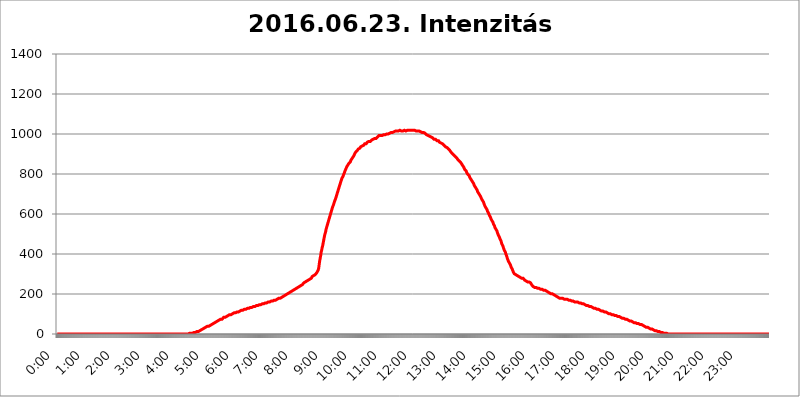
| Category | 2016.06.23. Intenzitás [W/m^2] |
|---|---|
| 0.0 | 0 |
| 0.0006944444444444445 | 0 |
| 0.001388888888888889 | 0 |
| 0.0020833333333333333 | 0 |
| 0.002777777777777778 | 0 |
| 0.003472222222222222 | 0 |
| 0.004166666666666667 | 0 |
| 0.004861111111111111 | 0 |
| 0.005555555555555556 | 0 |
| 0.0062499999999999995 | 0 |
| 0.006944444444444444 | 0 |
| 0.007638888888888889 | 0 |
| 0.008333333333333333 | 0 |
| 0.009027777777777779 | 0 |
| 0.009722222222222222 | 0 |
| 0.010416666666666666 | 0 |
| 0.011111111111111112 | 0 |
| 0.011805555555555555 | 0 |
| 0.012499999999999999 | 0 |
| 0.013194444444444444 | 0 |
| 0.013888888888888888 | 0 |
| 0.014583333333333332 | 0 |
| 0.015277777777777777 | 0 |
| 0.015972222222222224 | 0 |
| 0.016666666666666666 | 0 |
| 0.017361111111111112 | 0 |
| 0.018055555555555557 | 0 |
| 0.01875 | 0 |
| 0.019444444444444445 | 0 |
| 0.02013888888888889 | 0 |
| 0.020833333333333332 | 0 |
| 0.02152777777777778 | 0 |
| 0.022222222222222223 | 0 |
| 0.02291666666666667 | 0 |
| 0.02361111111111111 | 0 |
| 0.024305555555555556 | 0 |
| 0.024999999999999998 | 0 |
| 0.025694444444444447 | 0 |
| 0.02638888888888889 | 0 |
| 0.027083333333333334 | 0 |
| 0.027777777777777776 | 0 |
| 0.02847222222222222 | 0 |
| 0.029166666666666664 | 0 |
| 0.029861111111111113 | 0 |
| 0.030555555555555555 | 0 |
| 0.03125 | 0 |
| 0.03194444444444445 | 0 |
| 0.03263888888888889 | 0 |
| 0.03333333333333333 | 0 |
| 0.034027777777777775 | 0 |
| 0.034722222222222224 | 0 |
| 0.035416666666666666 | 0 |
| 0.036111111111111115 | 0 |
| 0.03680555555555556 | 0 |
| 0.0375 | 0 |
| 0.03819444444444444 | 0 |
| 0.03888888888888889 | 0 |
| 0.03958333333333333 | 0 |
| 0.04027777777777778 | 0 |
| 0.04097222222222222 | 0 |
| 0.041666666666666664 | 0 |
| 0.042361111111111106 | 0 |
| 0.04305555555555556 | 0 |
| 0.043750000000000004 | 0 |
| 0.044444444444444446 | 0 |
| 0.04513888888888889 | 0 |
| 0.04583333333333334 | 0 |
| 0.04652777777777778 | 0 |
| 0.04722222222222222 | 0 |
| 0.04791666666666666 | 0 |
| 0.04861111111111111 | 0 |
| 0.049305555555555554 | 0 |
| 0.049999999999999996 | 0 |
| 0.05069444444444445 | 0 |
| 0.051388888888888894 | 0 |
| 0.052083333333333336 | 0 |
| 0.05277777777777778 | 0 |
| 0.05347222222222222 | 0 |
| 0.05416666666666667 | 0 |
| 0.05486111111111111 | 0 |
| 0.05555555555555555 | 0 |
| 0.05625 | 0 |
| 0.05694444444444444 | 0 |
| 0.057638888888888885 | 0 |
| 0.05833333333333333 | 0 |
| 0.05902777777777778 | 0 |
| 0.059722222222222225 | 0 |
| 0.06041666666666667 | 0 |
| 0.061111111111111116 | 0 |
| 0.06180555555555556 | 0 |
| 0.0625 | 0 |
| 0.06319444444444444 | 0 |
| 0.06388888888888888 | 0 |
| 0.06458333333333334 | 0 |
| 0.06527777777777778 | 0 |
| 0.06597222222222222 | 0 |
| 0.06666666666666667 | 0 |
| 0.06736111111111111 | 0 |
| 0.06805555555555555 | 0 |
| 0.06874999999999999 | 0 |
| 0.06944444444444443 | 0 |
| 0.07013888888888889 | 0 |
| 0.07083333333333333 | 0 |
| 0.07152777777777779 | 0 |
| 0.07222222222222223 | 0 |
| 0.07291666666666667 | 0 |
| 0.07361111111111111 | 0 |
| 0.07430555555555556 | 0 |
| 0.075 | 0 |
| 0.07569444444444444 | 0 |
| 0.0763888888888889 | 0 |
| 0.07708333333333334 | 0 |
| 0.07777777777777778 | 0 |
| 0.07847222222222222 | 0 |
| 0.07916666666666666 | 0 |
| 0.0798611111111111 | 0 |
| 0.08055555555555556 | 0 |
| 0.08125 | 0 |
| 0.08194444444444444 | 0 |
| 0.08263888888888889 | 0 |
| 0.08333333333333333 | 0 |
| 0.08402777777777777 | 0 |
| 0.08472222222222221 | 0 |
| 0.08541666666666665 | 0 |
| 0.08611111111111112 | 0 |
| 0.08680555555555557 | 0 |
| 0.08750000000000001 | 0 |
| 0.08819444444444445 | 0 |
| 0.08888888888888889 | 0 |
| 0.08958333333333333 | 0 |
| 0.09027777777777778 | 0 |
| 0.09097222222222222 | 0 |
| 0.09166666666666667 | 0 |
| 0.09236111111111112 | 0 |
| 0.09305555555555556 | 0 |
| 0.09375 | 0 |
| 0.09444444444444444 | 0 |
| 0.09513888888888888 | 0 |
| 0.09583333333333333 | 0 |
| 0.09652777777777777 | 0 |
| 0.09722222222222222 | 0 |
| 0.09791666666666667 | 0 |
| 0.09861111111111111 | 0 |
| 0.09930555555555555 | 0 |
| 0.09999999999999999 | 0 |
| 0.10069444444444443 | 0 |
| 0.1013888888888889 | 0 |
| 0.10208333333333335 | 0 |
| 0.10277777777777779 | 0 |
| 0.10347222222222223 | 0 |
| 0.10416666666666667 | 0 |
| 0.10486111111111111 | 0 |
| 0.10555555555555556 | 0 |
| 0.10625 | 0 |
| 0.10694444444444444 | 0 |
| 0.1076388888888889 | 0 |
| 0.10833333333333334 | 0 |
| 0.10902777777777778 | 0 |
| 0.10972222222222222 | 0 |
| 0.1111111111111111 | 0 |
| 0.11180555555555556 | 0 |
| 0.11180555555555556 | 0 |
| 0.1125 | 0 |
| 0.11319444444444444 | 0 |
| 0.11388888888888889 | 0 |
| 0.11458333333333333 | 0 |
| 0.11527777777777777 | 0 |
| 0.11597222222222221 | 0 |
| 0.11666666666666665 | 0 |
| 0.1173611111111111 | 0 |
| 0.11805555555555557 | 0 |
| 0.11944444444444445 | 0 |
| 0.12013888888888889 | 0 |
| 0.12083333333333333 | 0 |
| 0.12152777777777778 | 0 |
| 0.12222222222222223 | 0 |
| 0.12291666666666667 | 0 |
| 0.12291666666666667 | 0 |
| 0.12361111111111112 | 0 |
| 0.12430555555555556 | 0 |
| 0.125 | 0 |
| 0.12569444444444444 | 0 |
| 0.12638888888888888 | 0 |
| 0.12708333333333333 | 0 |
| 0.16875 | 0 |
| 0.12847222222222224 | 0 |
| 0.12916666666666668 | 0 |
| 0.12986111111111112 | 0 |
| 0.13055555555555556 | 0 |
| 0.13125 | 0 |
| 0.13194444444444445 | 0 |
| 0.1326388888888889 | 0 |
| 0.13333333333333333 | 0 |
| 0.13402777777777777 | 0 |
| 0.13402777777777777 | 0 |
| 0.13472222222222222 | 0 |
| 0.13541666666666666 | 0 |
| 0.1361111111111111 | 0 |
| 0.13749999999999998 | 0 |
| 0.13819444444444443 | 0 |
| 0.1388888888888889 | 0 |
| 0.13958333333333334 | 0 |
| 0.14027777777777778 | 0 |
| 0.14097222222222222 | 0 |
| 0.14166666666666666 | 0 |
| 0.1423611111111111 | 0 |
| 0.14305555555555557 | 0 |
| 0.14375000000000002 | 0 |
| 0.14444444444444446 | 0 |
| 0.1451388888888889 | 0 |
| 0.1451388888888889 | 0 |
| 0.14652777777777778 | 0 |
| 0.14722222222222223 | 0 |
| 0.14791666666666667 | 0 |
| 0.1486111111111111 | 0 |
| 0.14930555555555555 | 0 |
| 0.15 | 0 |
| 0.15069444444444444 | 0 |
| 0.15138888888888888 | 0 |
| 0.15208333333333332 | 0 |
| 0.15277777777777776 | 0 |
| 0.15347222222222223 | 0 |
| 0.15416666666666667 | 0 |
| 0.15486111111111112 | 0 |
| 0.15555555555555556 | 0 |
| 0.15625 | 0 |
| 0.15694444444444444 | 0 |
| 0.15763888888888888 | 0 |
| 0.15833333333333333 | 0 |
| 0.15902777777777777 | 0 |
| 0.15972222222222224 | 0 |
| 0.16041666666666668 | 0 |
| 0.16111111111111112 | 0 |
| 0.16180555555555556 | 0 |
| 0.1625 | 0 |
| 0.16319444444444445 | 0 |
| 0.1638888888888889 | 0 |
| 0.16458333333333333 | 0 |
| 0.16527777777777777 | 0 |
| 0.16597222222222222 | 0 |
| 0.16666666666666666 | 0 |
| 0.1673611111111111 | 0 |
| 0.16805555555555554 | 0 |
| 0.16874999999999998 | 0 |
| 0.16944444444444443 | 0 |
| 0.17013888888888887 | 0 |
| 0.1708333333333333 | 0 |
| 0.17152777777777775 | 0 |
| 0.17222222222222225 | 0 |
| 0.1729166666666667 | 0 |
| 0.17361111111111113 | 0 |
| 0.17430555555555557 | 0 |
| 0.17500000000000002 | 0 |
| 0.17569444444444446 | 0 |
| 0.1763888888888889 | 0 |
| 0.17708333333333334 | 0 |
| 0.17777777777777778 | 0 |
| 0.17847222222222223 | 0 |
| 0.17916666666666667 | 0 |
| 0.1798611111111111 | 0 |
| 0.18055555555555555 | 0 |
| 0.18125 | 0 |
| 0.18194444444444444 | 0 |
| 0.1826388888888889 | 0 |
| 0.18333333333333335 | 0 |
| 0.1840277777777778 | 0 |
| 0.18472222222222223 | 0 |
| 0.18541666666666667 | 3.525 |
| 0.18611111111111112 | 3.525 |
| 0.18680555555555556 | 3.525 |
| 0.1875 | 3.525 |
| 0.18819444444444444 | 3.525 |
| 0.18888888888888888 | 3.525 |
| 0.18958333333333333 | 3.525 |
| 0.19027777777777777 | 3.525 |
| 0.1909722222222222 | 3.525 |
| 0.19166666666666665 | 7.887 |
| 0.19236111111111112 | 7.887 |
| 0.19305555555555554 | 7.887 |
| 0.19375 | 7.887 |
| 0.19444444444444445 | 7.887 |
| 0.1951388888888889 | 12.257 |
| 0.19583333333333333 | 12.257 |
| 0.19652777777777777 | 12.257 |
| 0.19722222222222222 | 12.257 |
| 0.19791666666666666 | 12.257 |
| 0.1986111111111111 | 16.636 |
| 0.19930555555555554 | 16.636 |
| 0.19999999999999998 | 16.636 |
| 0.20069444444444443 | 21.024 |
| 0.20138888888888887 | 21.024 |
| 0.2020833333333333 | 21.024 |
| 0.2027777777777778 | 21.024 |
| 0.2034722222222222 | 21.024 |
| 0.2041666666666667 | 25.419 |
| 0.20486111111111113 | 25.419 |
| 0.20555555555555557 | 25.419 |
| 0.20625000000000002 | 29.823 |
| 0.20694444444444446 | 29.823 |
| 0.2076388888888889 | 29.823 |
| 0.20833333333333334 | 34.234 |
| 0.20902777777777778 | 34.234 |
| 0.20972222222222223 | 34.234 |
| 0.21041666666666667 | 38.653 |
| 0.2111111111111111 | 38.653 |
| 0.21180555555555555 | 38.653 |
| 0.2125 | 38.653 |
| 0.21319444444444444 | 43.079 |
| 0.2138888888888889 | 43.079 |
| 0.21458333333333335 | 43.079 |
| 0.2152777777777778 | 47.511 |
| 0.21597222222222223 | 47.511 |
| 0.21666666666666667 | 47.511 |
| 0.21736111111111112 | 47.511 |
| 0.21805555555555556 | 51.951 |
| 0.21875 | 51.951 |
| 0.21944444444444444 | 51.951 |
| 0.22013888888888888 | 56.398 |
| 0.22083333333333333 | 56.398 |
| 0.22152777777777777 | 56.398 |
| 0.2222222222222222 | 60.85 |
| 0.22291666666666665 | 60.85 |
| 0.2236111111111111 | 60.85 |
| 0.22430555555555556 | 65.31 |
| 0.225 | 65.31 |
| 0.22569444444444445 | 65.31 |
| 0.2263888888888889 | 65.31 |
| 0.22708333333333333 | 69.775 |
| 0.22777777777777777 | 69.775 |
| 0.22847222222222222 | 69.775 |
| 0.22916666666666666 | 74.246 |
| 0.2298611111111111 | 74.246 |
| 0.23055555555555554 | 74.246 |
| 0.23124999999999998 | 74.246 |
| 0.23194444444444443 | 78.722 |
| 0.23263888888888887 | 78.722 |
| 0.2333333333333333 | 83.205 |
| 0.2340277777777778 | 83.205 |
| 0.2347222222222222 | 83.205 |
| 0.2354166666666667 | 83.205 |
| 0.23611111111111113 | 83.205 |
| 0.23680555555555557 | 87.692 |
| 0.23750000000000002 | 87.692 |
| 0.23819444444444446 | 92.184 |
| 0.2388888888888889 | 92.184 |
| 0.23958333333333334 | 92.184 |
| 0.24027777777777778 | 92.184 |
| 0.24097222222222223 | 92.184 |
| 0.24166666666666667 | 96.682 |
| 0.2423611111111111 | 96.682 |
| 0.24305555555555555 | 96.682 |
| 0.24375 | 96.682 |
| 0.24444444444444446 | 101.184 |
| 0.24513888888888888 | 101.184 |
| 0.24583333333333335 | 101.184 |
| 0.2465277777777778 | 101.184 |
| 0.24722222222222223 | 101.184 |
| 0.24791666666666667 | 105.69 |
| 0.24861111111111112 | 105.69 |
| 0.24930555555555556 | 105.69 |
| 0.25 | 105.69 |
| 0.25069444444444444 | 110.201 |
| 0.2513888888888889 | 110.201 |
| 0.2520833333333333 | 110.201 |
| 0.25277777777777777 | 110.201 |
| 0.2534722222222222 | 110.201 |
| 0.25416666666666665 | 110.201 |
| 0.2548611111111111 | 114.716 |
| 0.2555555555555556 | 114.716 |
| 0.25625000000000003 | 114.716 |
| 0.2569444444444445 | 114.716 |
| 0.2576388888888889 | 119.235 |
| 0.25833333333333336 | 119.235 |
| 0.2590277777777778 | 119.235 |
| 0.25972222222222224 | 119.235 |
| 0.2604166666666667 | 119.235 |
| 0.2611111111111111 | 119.235 |
| 0.26180555555555557 | 119.235 |
| 0.2625 | 123.758 |
| 0.26319444444444445 | 123.758 |
| 0.2638888888888889 | 123.758 |
| 0.26458333333333334 | 123.758 |
| 0.2652777777777778 | 123.758 |
| 0.2659722222222222 | 128.284 |
| 0.26666666666666666 | 128.284 |
| 0.2673611111111111 | 128.284 |
| 0.26805555555555555 | 128.284 |
| 0.26875 | 128.284 |
| 0.26944444444444443 | 128.284 |
| 0.2701388888888889 | 132.814 |
| 0.2708333333333333 | 132.814 |
| 0.27152777777777776 | 132.814 |
| 0.2722222222222222 | 132.814 |
| 0.27291666666666664 | 132.814 |
| 0.2736111111111111 | 132.814 |
| 0.2743055555555555 | 137.347 |
| 0.27499999999999997 | 137.347 |
| 0.27569444444444446 | 137.347 |
| 0.27638888888888885 | 137.347 |
| 0.27708333333333335 | 137.347 |
| 0.2777777777777778 | 137.347 |
| 0.27847222222222223 | 137.347 |
| 0.2791666666666667 | 141.884 |
| 0.2798611111111111 | 141.884 |
| 0.28055555555555556 | 141.884 |
| 0.28125 | 141.884 |
| 0.28194444444444444 | 141.884 |
| 0.2826388888888889 | 146.423 |
| 0.2833333333333333 | 146.423 |
| 0.28402777777777777 | 146.423 |
| 0.2847222222222222 | 146.423 |
| 0.28541666666666665 | 146.423 |
| 0.28611111111111115 | 146.423 |
| 0.28680555555555554 | 146.423 |
| 0.28750000000000003 | 150.964 |
| 0.2881944444444445 | 150.964 |
| 0.2888888888888889 | 150.964 |
| 0.28958333333333336 | 150.964 |
| 0.2902777777777778 | 155.509 |
| 0.29097222222222224 | 155.509 |
| 0.2916666666666667 | 155.509 |
| 0.2923611111111111 | 155.509 |
| 0.29305555555555557 | 155.509 |
| 0.29375 | 155.509 |
| 0.29444444444444445 | 155.509 |
| 0.2951388888888889 | 160.056 |
| 0.29583333333333334 | 160.056 |
| 0.2965277777777778 | 160.056 |
| 0.2972222222222222 | 160.056 |
| 0.29791666666666666 | 160.056 |
| 0.2986111111111111 | 164.605 |
| 0.29930555555555555 | 164.605 |
| 0.3 | 164.605 |
| 0.30069444444444443 | 164.605 |
| 0.3013888888888889 | 164.605 |
| 0.3020833333333333 | 164.605 |
| 0.30277777777777776 | 164.605 |
| 0.3034722222222222 | 169.156 |
| 0.30416666666666664 | 169.156 |
| 0.3048611111111111 | 169.156 |
| 0.3055555555555555 | 169.156 |
| 0.30624999999999997 | 169.156 |
| 0.3069444444444444 | 173.709 |
| 0.3076388888888889 | 173.709 |
| 0.30833333333333335 | 173.709 |
| 0.3090277777777778 | 173.709 |
| 0.30972222222222223 | 173.709 |
| 0.3104166666666667 | 178.264 |
| 0.3111111111111111 | 178.264 |
| 0.31180555555555556 | 178.264 |
| 0.3125 | 178.264 |
| 0.31319444444444444 | 182.82 |
| 0.3138888888888889 | 182.82 |
| 0.3145833333333333 | 182.82 |
| 0.31527777777777777 | 182.82 |
| 0.3159722222222222 | 187.378 |
| 0.31666666666666665 | 187.378 |
| 0.31736111111111115 | 191.937 |
| 0.31805555555555554 | 191.937 |
| 0.31875000000000003 | 191.937 |
| 0.3194444444444445 | 196.497 |
| 0.3201388888888889 | 196.497 |
| 0.32083333333333336 | 196.497 |
| 0.3215277777777778 | 201.058 |
| 0.32222222222222224 | 201.058 |
| 0.3229166666666667 | 201.058 |
| 0.3236111111111111 | 205.62 |
| 0.32430555555555557 | 205.62 |
| 0.325 | 205.62 |
| 0.32569444444444445 | 210.182 |
| 0.3263888888888889 | 210.182 |
| 0.32708333333333334 | 210.182 |
| 0.3277777777777778 | 210.182 |
| 0.3284722222222222 | 214.746 |
| 0.32916666666666666 | 214.746 |
| 0.3298611111111111 | 219.309 |
| 0.33055555555555555 | 219.309 |
| 0.33125 | 219.309 |
| 0.33194444444444443 | 219.309 |
| 0.3326388888888889 | 223.873 |
| 0.3333333333333333 | 223.873 |
| 0.3340277777777778 | 228.436 |
| 0.3347222222222222 | 228.436 |
| 0.3354166666666667 | 228.436 |
| 0.3361111111111111 | 228.436 |
| 0.3368055555555556 | 233 |
| 0.33749999999999997 | 233 |
| 0.33819444444444446 | 233 |
| 0.33888888888888885 | 237.564 |
| 0.33958333333333335 | 237.564 |
| 0.34027777777777773 | 237.564 |
| 0.34097222222222223 | 242.127 |
| 0.3416666666666666 | 242.127 |
| 0.3423611111111111 | 246.689 |
| 0.3430555555555555 | 246.689 |
| 0.34375 | 246.689 |
| 0.3444444444444445 | 251.251 |
| 0.3451388888888889 | 251.251 |
| 0.3458333333333334 | 255.813 |
| 0.34652777777777777 | 255.813 |
| 0.34722222222222227 | 255.813 |
| 0.34791666666666665 | 260.373 |
| 0.34861111111111115 | 260.373 |
| 0.34930555555555554 | 260.373 |
| 0.35000000000000003 | 264.932 |
| 0.3506944444444444 | 264.932 |
| 0.3513888888888889 | 264.932 |
| 0.3520833333333333 | 269.49 |
| 0.3527777777777778 | 269.49 |
| 0.3534722222222222 | 274.047 |
| 0.3541666666666667 | 274.047 |
| 0.3548611111111111 | 278.603 |
| 0.35555555555555557 | 278.603 |
| 0.35625 | 278.603 |
| 0.35694444444444445 | 283.156 |
| 0.3576388888888889 | 287.709 |
| 0.35833333333333334 | 287.709 |
| 0.3590277777777778 | 287.709 |
| 0.3597222222222222 | 292.259 |
| 0.36041666666666666 | 292.259 |
| 0.3611111111111111 | 296.808 |
| 0.36180555555555555 | 296.808 |
| 0.3625 | 301.354 |
| 0.36319444444444443 | 301.354 |
| 0.3638888888888889 | 305.898 |
| 0.3645833333333333 | 305.898 |
| 0.3652777777777778 | 310.44 |
| 0.3659722222222222 | 319.517 |
| 0.3666666666666667 | 328.584 |
| 0.3673611111111111 | 346.682 |
| 0.3680555555555556 | 364.728 |
| 0.36874999999999997 | 378.224 |
| 0.36944444444444446 | 391.685 |
| 0.37013888888888885 | 409.574 |
| 0.37083333333333335 | 418.492 |
| 0.37152777777777773 | 431.833 |
| 0.37222222222222223 | 440.702 |
| 0.3729166666666666 | 453.968 |
| 0.3736111111111111 | 467.187 |
| 0.3743055555555555 | 480.356 |
| 0.375 | 493.475 |
| 0.3756944444444445 | 502.192 |
| 0.3763888888888889 | 510.885 |
| 0.3770833333333334 | 523.88 |
| 0.37777777777777777 | 532.513 |
| 0.37847222222222227 | 541.121 |
| 0.37916666666666665 | 549.704 |
| 0.37986111111111115 | 558.261 |
| 0.38055555555555554 | 566.793 |
| 0.38125000000000003 | 575.299 |
| 0.3819444444444444 | 583.779 |
| 0.3826388888888889 | 592.233 |
| 0.3833333333333333 | 600.661 |
| 0.3840277777777778 | 609.062 |
| 0.3847222222222222 | 617.436 |
| 0.3854166666666667 | 625.784 |
| 0.3861111111111111 | 634.105 |
| 0.38680555555555557 | 638.256 |
| 0.3875 | 646.537 |
| 0.38819444444444445 | 654.791 |
| 0.3888888888888889 | 663.019 |
| 0.38958333333333334 | 667.123 |
| 0.3902777777777778 | 675.311 |
| 0.3909722222222222 | 683.473 |
| 0.39166666666666666 | 691.608 |
| 0.3923611111111111 | 699.717 |
| 0.39305555555555555 | 703.762 |
| 0.39375 | 715.858 |
| 0.39444444444444443 | 723.889 |
| 0.3951388888888889 | 731.896 |
| 0.3958333333333333 | 739.877 |
| 0.3965277777777778 | 747.834 |
| 0.3972222222222222 | 755.766 |
| 0.3979166666666667 | 763.674 |
| 0.3986111111111111 | 771.559 |
| 0.3993055555555556 | 779.42 |
| 0.39999999999999997 | 783.342 |
| 0.40069444444444446 | 787.258 |
| 0.40138888888888885 | 795.074 |
| 0.40208333333333335 | 798.974 |
| 0.40277777777777773 | 806.757 |
| 0.40347222222222223 | 814.519 |
| 0.4041666666666666 | 818.392 |
| 0.4048611111111111 | 826.123 |
| 0.4055555555555555 | 829.981 |
| 0.40625 | 837.682 |
| 0.4069444444444445 | 841.526 |
| 0.4076388888888889 | 845.365 |
| 0.4083333333333334 | 849.199 |
| 0.40902777777777777 | 853.029 |
| 0.40972222222222227 | 853.029 |
| 0.41041666666666665 | 856.855 |
| 0.41111111111111115 | 860.676 |
| 0.41180555555555554 | 868.305 |
| 0.41250000000000003 | 872.114 |
| 0.4131944444444444 | 875.918 |
| 0.4138888888888889 | 875.918 |
| 0.4145833333333333 | 883.516 |
| 0.4152777777777778 | 887.309 |
| 0.4159722222222222 | 891.099 |
| 0.4166666666666667 | 894.885 |
| 0.4173611111111111 | 902.447 |
| 0.41805555555555557 | 906.223 |
| 0.41875 | 909.996 |
| 0.41944444444444445 | 909.996 |
| 0.4201388888888889 | 913.766 |
| 0.42083333333333334 | 917.534 |
| 0.4215277777777778 | 921.298 |
| 0.4222222222222222 | 925.06 |
| 0.42291666666666666 | 925.06 |
| 0.4236111111111111 | 928.819 |
| 0.42430555555555555 | 928.819 |
| 0.425 | 932.576 |
| 0.42569444444444443 | 936.33 |
| 0.4263888888888889 | 936.33 |
| 0.4270833333333333 | 940.082 |
| 0.4277777777777778 | 940.082 |
| 0.4284722222222222 | 940.082 |
| 0.4291666666666667 | 943.832 |
| 0.4298611111111111 | 943.832 |
| 0.4305555555555556 | 947.58 |
| 0.43124999999999997 | 951.327 |
| 0.43194444444444446 | 951.327 |
| 0.43263888888888885 | 951.327 |
| 0.43333333333333335 | 951.327 |
| 0.43402777777777773 | 955.071 |
| 0.43472222222222223 | 958.814 |
| 0.4354166666666666 | 958.814 |
| 0.4361111111111111 | 958.814 |
| 0.4368055555555555 | 962.555 |
| 0.4375 | 962.555 |
| 0.4381944444444445 | 962.555 |
| 0.4388888888888889 | 962.555 |
| 0.4395833333333334 | 966.295 |
| 0.44027777777777777 | 966.295 |
| 0.44097222222222227 | 970.034 |
| 0.44166666666666665 | 970.034 |
| 0.44236111111111115 | 970.034 |
| 0.44305555555555554 | 973.772 |
| 0.44375000000000003 | 973.772 |
| 0.4444444444444444 | 973.772 |
| 0.4451388888888889 | 977.508 |
| 0.4458333333333333 | 977.508 |
| 0.4465277777777778 | 977.508 |
| 0.4472222222222222 | 977.508 |
| 0.4479166666666667 | 981.244 |
| 0.4486111111111111 | 981.244 |
| 0.44930555555555557 | 984.98 |
| 0.45 | 984.98 |
| 0.45069444444444445 | 988.714 |
| 0.4513888888888889 | 992.448 |
| 0.45208333333333334 | 992.448 |
| 0.4527777777777778 | 992.448 |
| 0.4534722222222222 | 992.448 |
| 0.45416666666666666 | 992.448 |
| 0.4548611111111111 | 992.448 |
| 0.45555555555555555 | 992.448 |
| 0.45625 | 996.182 |
| 0.45694444444444443 | 996.182 |
| 0.4576388888888889 | 996.182 |
| 0.4583333333333333 | 996.182 |
| 0.4590277777777778 | 996.182 |
| 0.4597222222222222 | 996.182 |
| 0.4604166666666667 | 996.182 |
| 0.4611111111111111 | 996.182 |
| 0.4618055555555556 | 999.916 |
| 0.46249999999999997 | 999.916 |
| 0.46319444444444446 | 999.916 |
| 0.46388888888888885 | 999.916 |
| 0.46458333333333335 | 1003.65 |
| 0.46527777777777773 | 1003.65 |
| 0.46597222222222223 | 1003.65 |
| 0.4666666666666666 | 1003.65 |
| 0.4673611111111111 | 1003.65 |
| 0.4680555555555555 | 1007.383 |
| 0.46875 | 1007.383 |
| 0.4694444444444445 | 1007.383 |
| 0.4701388888888889 | 1007.383 |
| 0.4708333333333334 | 1007.383 |
| 0.47152777777777777 | 1011.118 |
| 0.47222222222222227 | 1011.118 |
| 0.47291666666666665 | 1011.118 |
| 0.47361111111111115 | 1011.118 |
| 0.47430555555555554 | 1014.852 |
| 0.47500000000000003 | 1014.852 |
| 0.4756944444444444 | 1014.852 |
| 0.4763888888888889 | 1014.852 |
| 0.4770833333333333 | 1014.852 |
| 0.4777777777777778 | 1014.852 |
| 0.4784722222222222 | 1014.852 |
| 0.4791666666666667 | 1014.852 |
| 0.4798611111111111 | 1014.852 |
| 0.48055555555555557 | 1018.587 |
| 0.48125 | 1018.587 |
| 0.48194444444444445 | 1018.587 |
| 0.4826388888888889 | 1014.852 |
| 0.48333333333333334 | 1014.852 |
| 0.4840277777777778 | 1014.852 |
| 0.4847222222222222 | 1014.852 |
| 0.48541666666666666 | 1014.852 |
| 0.4861111111111111 | 1018.587 |
| 0.48680555555555555 | 1018.587 |
| 0.4875 | 1014.852 |
| 0.48819444444444443 | 1018.587 |
| 0.4888888888888889 | 1014.852 |
| 0.4895833333333333 | 1018.587 |
| 0.4902777777777778 | 1018.587 |
| 0.4909722222222222 | 1018.587 |
| 0.4916666666666667 | 1018.587 |
| 0.4923611111111111 | 1018.587 |
| 0.4930555555555556 | 1018.587 |
| 0.49374999999999997 | 1018.587 |
| 0.49444444444444446 | 1018.587 |
| 0.49513888888888885 | 1018.587 |
| 0.49583333333333335 | 1018.587 |
| 0.49652777777777773 | 1018.587 |
| 0.49722222222222223 | 1018.587 |
| 0.4979166666666666 | 1014.852 |
| 0.4986111111111111 | 1018.587 |
| 0.4993055555555555 | 1018.587 |
| 0.5 | 1018.587 |
| 0.5006944444444444 | 1018.587 |
| 0.5013888888888889 | 1018.587 |
| 0.5020833333333333 | 1018.587 |
| 0.5027777777777778 | 1014.852 |
| 0.5034722222222222 | 1014.852 |
| 0.5041666666666667 | 1014.852 |
| 0.5048611111111111 | 1018.587 |
| 0.5055555555555555 | 1014.852 |
| 0.50625 | 1014.852 |
| 0.5069444444444444 | 1014.852 |
| 0.5076388888888889 | 1014.852 |
| 0.5083333333333333 | 1014.852 |
| 0.5090277777777777 | 1014.852 |
| 0.5097222222222222 | 1011.118 |
| 0.5104166666666666 | 1011.118 |
| 0.5111111111111112 | 1007.383 |
| 0.5118055555555555 | 1007.383 |
| 0.5125000000000001 | 1007.383 |
| 0.5131944444444444 | 1007.383 |
| 0.513888888888889 | 1007.383 |
| 0.5145833333333333 | 1003.65 |
| 0.5152777777777778 | 1003.65 |
| 0.5159722222222222 | 1003.65 |
| 0.5166666666666667 | 999.916 |
| 0.517361111111111 | 999.916 |
| 0.5180555555555556 | 996.182 |
| 0.5187499999999999 | 996.182 |
| 0.5194444444444445 | 996.182 |
| 0.5201388888888888 | 992.448 |
| 0.5208333333333334 | 992.448 |
| 0.5215277777777778 | 992.448 |
| 0.5222222222222223 | 988.714 |
| 0.5229166666666667 | 988.714 |
| 0.5236111111111111 | 984.98 |
| 0.5243055555555556 | 984.98 |
| 0.525 | 981.244 |
| 0.5256944444444445 | 981.244 |
| 0.5263888888888889 | 981.244 |
| 0.5270833333333333 | 977.508 |
| 0.5277777777777778 | 977.508 |
| 0.5284722222222222 | 973.772 |
| 0.5291666666666667 | 973.772 |
| 0.5298611111111111 | 973.772 |
| 0.5305555555555556 | 973.772 |
| 0.53125 | 973.772 |
| 0.5319444444444444 | 970.034 |
| 0.5326388888888889 | 966.295 |
| 0.5333333333333333 | 966.295 |
| 0.5340277777777778 | 966.295 |
| 0.5347222222222222 | 966.295 |
| 0.5354166666666667 | 962.555 |
| 0.5361111111111111 | 958.814 |
| 0.5368055555555555 | 958.814 |
| 0.5375 | 958.814 |
| 0.5381944444444444 | 955.071 |
| 0.5388888888888889 | 955.071 |
| 0.5395833333333333 | 955.071 |
| 0.5402777777777777 | 951.327 |
| 0.5409722222222222 | 947.58 |
| 0.5416666666666666 | 947.58 |
| 0.5423611111111112 | 943.832 |
| 0.5430555555555555 | 940.082 |
| 0.5437500000000001 | 940.082 |
| 0.5444444444444444 | 936.33 |
| 0.545138888888889 | 932.576 |
| 0.5458333333333333 | 932.576 |
| 0.5465277777777778 | 932.576 |
| 0.5472222222222222 | 932.576 |
| 0.5479166666666667 | 928.819 |
| 0.548611111111111 | 925.06 |
| 0.5493055555555556 | 921.298 |
| 0.5499999999999999 | 921.298 |
| 0.5506944444444445 | 917.534 |
| 0.5513888888888888 | 913.766 |
| 0.5520833333333334 | 909.996 |
| 0.5527777777777778 | 906.223 |
| 0.5534722222222223 | 906.223 |
| 0.5541666666666667 | 902.447 |
| 0.5548611111111111 | 902.447 |
| 0.5555555555555556 | 898.668 |
| 0.55625 | 894.885 |
| 0.5569444444444445 | 894.885 |
| 0.5576388888888889 | 891.099 |
| 0.5583333333333333 | 887.309 |
| 0.5590277777777778 | 887.309 |
| 0.5597222222222222 | 883.516 |
| 0.5604166666666667 | 879.719 |
| 0.5611111111111111 | 875.918 |
| 0.5618055555555556 | 872.114 |
| 0.5625 | 868.305 |
| 0.5631944444444444 | 868.305 |
| 0.5638888888888889 | 864.493 |
| 0.5645833333333333 | 860.676 |
| 0.5652777777777778 | 860.676 |
| 0.5659722222222222 | 856.855 |
| 0.5666666666666667 | 853.029 |
| 0.5673611111111111 | 849.199 |
| 0.5680555555555555 | 845.365 |
| 0.56875 | 841.526 |
| 0.5694444444444444 | 837.682 |
| 0.5701388888888889 | 833.834 |
| 0.5708333333333333 | 829.981 |
| 0.5715277777777777 | 822.26 |
| 0.5722222222222222 | 822.26 |
| 0.5729166666666666 | 818.392 |
| 0.5736111111111112 | 814.519 |
| 0.5743055555555555 | 806.757 |
| 0.5750000000000001 | 806.757 |
| 0.5756944444444444 | 798.974 |
| 0.576388888888889 | 798.974 |
| 0.5770833333333333 | 795.074 |
| 0.5777777777777778 | 791.169 |
| 0.5784722222222222 | 783.342 |
| 0.5791666666666667 | 783.342 |
| 0.579861111111111 | 775.492 |
| 0.5805555555555556 | 771.559 |
| 0.5812499999999999 | 767.62 |
| 0.5819444444444445 | 763.674 |
| 0.5826388888888888 | 759.723 |
| 0.5833333333333334 | 755.766 |
| 0.5840277777777778 | 751.803 |
| 0.5847222222222223 | 743.859 |
| 0.5854166666666667 | 739.877 |
| 0.5861111111111111 | 735.89 |
| 0.5868055555555556 | 731.896 |
| 0.5875 | 727.896 |
| 0.5881944444444445 | 723.889 |
| 0.5888888888888889 | 719.877 |
| 0.5895833333333333 | 711.832 |
| 0.5902777777777778 | 707.8 |
| 0.5909722222222222 | 703.762 |
| 0.5916666666666667 | 699.717 |
| 0.5923611111111111 | 695.666 |
| 0.5930555555555556 | 691.608 |
| 0.59375 | 687.544 |
| 0.5944444444444444 | 683.473 |
| 0.5951388888888889 | 675.311 |
| 0.5958333333333333 | 675.311 |
| 0.5965277777777778 | 667.123 |
| 0.5972222222222222 | 663.019 |
| 0.5979166666666667 | 658.909 |
| 0.5986111111111111 | 650.667 |
| 0.5993055555555555 | 646.537 |
| 0.6 | 638.256 |
| 0.6006944444444444 | 634.105 |
| 0.6013888888888889 | 629.948 |
| 0.6020833333333333 | 625.784 |
| 0.6027777777777777 | 621.613 |
| 0.6034722222222222 | 613.252 |
| 0.6041666666666666 | 609.062 |
| 0.6048611111111112 | 604.864 |
| 0.6055555555555555 | 600.661 |
| 0.6062500000000001 | 592.233 |
| 0.6069444444444444 | 588.009 |
| 0.607638888888889 | 583.779 |
| 0.6083333333333333 | 575.299 |
| 0.6090277777777778 | 571.049 |
| 0.6097222222222222 | 566.793 |
| 0.6104166666666667 | 562.53 |
| 0.611111111111111 | 558.261 |
| 0.6118055555555556 | 549.704 |
| 0.6124999999999999 | 545.416 |
| 0.6131944444444445 | 541.121 |
| 0.6138888888888888 | 532.513 |
| 0.6145833333333334 | 528.2 |
| 0.6152777777777778 | 523.88 |
| 0.6159722222222223 | 519.555 |
| 0.6166666666666667 | 515.223 |
| 0.6173611111111111 | 506.542 |
| 0.6180555555555556 | 502.192 |
| 0.61875 | 493.475 |
| 0.6194444444444445 | 489.108 |
| 0.6201388888888889 | 484.735 |
| 0.6208333333333333 | 475.972 |
| 0.6215277777777778 | 471.582 |
| 0.6222222222222222 | 467.187 |
| 0.6229166666666667 | 458.38 |
| 0.6236111111111111 | 449.551 |
| 0.6243055555555556 | 445.129 |
| 0.625 | 440.702 |
| 0.6256944444444444 | 431.833 |
| 0.6263888888888889 | 427.39 |
| 0.6270833333333333 | 418.492 |
| 0.6277777777777778 | 414.035 |
| 0.6284722222222222 | 409.574 |
| 0.6291666666666667 | 400.638 |
| 0.6298611111111111 | 396.164 |
| 0.6305555555555555 | 387.202 |
| 0.63125 | 378.224 |
| 0.6319444444444444 | 373.729 |
| 0.6326388888888889 | 364.728 |
| 0.6333333333333333 | 360.221 |
| 0.6340277777777777 | 355.712 |
| 0.6347222222222222 | 351.198 |
| 0.6354166666666666 | 346.682 |
| 0.6361111111111112 | 342.162 |
| 0.6368055555555555 | 333.113 |
| 0.6375000000000001 | 333.113 |
| 0.6381944444444444 | 324.052 |
| 0.638888888888889 | 319.517 |
| 0.6395833333333333 | 310.44 |
| 0.6402777777777778 | 305.898 |
| 0.6409722222222222 | 301.354 |
| 0.6416666666666667 | 301.354 |
| 0.642361111111111 | 296.808 |
| 0.6430555555555556 | 296.808 |
| 0.6437499999999999 | 296.808 |
| 0.6444444444444445 | 292.259 |
| 0.6451388888888888 | 292.259 |
| 0.6458333333333334 | 287.709 |
| 0.6465277777777778 | 287.709 |
| 0.6472222222222223 | 287.709 |
| 0.6479166666666667 | 287.709 |
| 0.6486111111111111 | 287.709 |
| 0.6493055555555556 | 283.156 |
| 0.65 | 283.156 |
| 0.6506944444444445 | 283.156 |
| 0.6513888888888889 | 278.603 |
| 0.6520833333333333 | 278.603 |
| 0.6527777777777778 | 278.603 |
| 0.6534722222222222 | 278.603 |
| 0.6541666666666667 | 274.047 |
| 0.6548611111111111 | 274.047 |
| 0.6555555555555556 | 269.49 |
| 0.65625 | 269.49 |
| 0.6569444444444444 | 269.49 |
| 0.6576388888888889 | 264.932 |
| 0.6583333333333333 | 264.932 |
| 0.6590277777777778 | 260.373 |
| 0.6597222222222222 | 260.373 |
| 0.6604166666666667 | 260.373 |
| 0.6611111111111111 | 260.373 |
| 0.6618055555555555 | 260.373 |
| 0.6625 | 260.373 |
| 0.6631944444444444 | 260.373 |
| 0.6638888888888889 | 255.813 |
| 0.6645833333333333 | 255.813 |
| 0.6652777777777777 | 246.689 |
| 0.6659722222222222 | 242.127 |
| 0.6666666666666666 | 242.127 |
| 0.6673611111111111 | 237.564 |
| 0.6680555555555556 | 233 |
| 0.6687500000000001 | 233 |
| 0.6694444444444444 | 233 |
| 0.6701388888888888 | 233 |
| 0.6708333333333334 | 233 |
| 0.6715277777777778 | 233 |
| 0.6722222222222222 | 233 |
| 0.6729166666666666 | 228.436 |
| 0.6736111111111112 | 228.436 |
| 0.6743055555555556 | 228.436 |
| 0.6749999999999999 | 228.436 |
| 0.6756944444444444 | 228.436 |
| 0.6763888888888889 | 228.436 |
| 0.6770833333333334 | 228.436 |
| 0.6777777777777777 | 223.873 |
| 0.6784722222222223 | 223.873 |
| 0.6791666666666667 | 223.873 |
| 0.6798611111111111 | 223.873 |
| 0.6805555555555555 | 223.873 |
| 0.68125 | 219.309 |
| 0.6819444444444445 | 219.309 |
| 0.6826388888888889 | 219.309 |
| 0.6833333333333332 | 219.309 |
| 0.6840277777777778 | 219.309 |
| 0.6847222222222222 | 219.309 |
| 0.6854166666666667 | 214.746 |
| 0.686111111111111 | 214.746 |
| 0.6868055555555556 | 214.746 |
| 0.6875 | 210.182 |
| 0.6881944444444444 | 210.182 |
| 0.688888888888889 | 210.182 |
| 0.6895833333333333 | 210.182 |
| 0.6902777777777778 | 205.62 |
| 0.6909722222222222 | 205.62 |
| 0.6916666666666668 | 205.62 |
| 0.6923611111111111 | 201.058 |
| 0.6930555555555555 | 201.058 |
| 0.69375 | 201.058 |
| 0.6944444444444445 | 201.058 |
| 0.6951388888888889 | 196.497 |
| 0.6958333333333333 | 196.497 |
| 0.6965277777777777 | 196.497 |
| 0.6972222222222223 | 196.497 |
| 0.6979166666666666 | 191.937 |
| 0.6986111111111111 | 191.937 |
| 0.6993055555555556 | 191.937 |
| 0.7000000000000001 | 187.378 |
| 0.7006944444444444 | 187.378 |
| 0.7013888888888888 | 182.82 |
| 0.7020833333333334 | 182.82 |
| 0.7027777777777778 | 182.82 |
| 0.7034722222222222 | 182.82 |
| 0.7041666666666666 | 182.82 |
| 0.7048611111111112 | 178.264 |
| 0.7055555555555556 | 182.82 |
| 0.7062499999999999 | 178.264 |
| 0.7069444444444444 | 178.264 |
| 0.7076388888888889 | 178.264 |
| 0.7083333333333334 | 178.264 |
| 0.7090277777777777 | 178.264 |
| 0.7097222222222223 | 173.709 |
| 0.7104166666666667 | 173.709 |
| 0.7111111111111111 | 173.709 |
| 0.7118055555555555 | 173.709 |
| 0.7125 | 173.709 |
| 0.7131944444444445 | 173.709 |
| 0.7138888888888889 | 173.709 |
| 0.7145833333333332 | 173.709 |
| 0.7152777777777778 | 173.709 |
| 0.7159722222222222 | 173.709 |
| 0.7166666666666667 | 169.156 |
| 0.717361111111111 | 169.156 |
| 0.7180555555555556 | 169.156 |
| 0.71875 | 169.156 |
| 0.7194444444444444 | 169.156 |
| 0.720138888888889 | 164.605 |
| 0.7208333333333333 | 164.605 |
| 0.7215277777777778 | 164.605 |
| 0.7222222222222222 | 164.605 |
| 0.7229166666666668 | 164.605 |
| 0.7236111111111111 | 164.605 |
| 0.7243055555555555 | 164.605 |
| 0.725 | 160.056 |
| 0.7256944444444445 | 160.056 |
| 0.7263888888888889 | 160.056 |
| 0.7270833333333333 | 160.056 |
| 0.7277777777777777 | 160.056 |
| 0.7284722222222223 | 160.056 |
| 0.7291666666666666 | 160.056 |
| 0.7298611111111111 | 160.056 |
| 0.7305555555555556 | 160.056 |
| 0.7312500000000001 | 155.509 |
| 0.7319444444444444 | 155.509 |
| 0.7326388888888888 | 155.509 |
| 0.7333333333333334 | 155.509 |
| 0.7340277777777778 | 155.509 |
| 0.7347222222222222 | 155.509 |
| 0.7354166666666666 | 150.964 |
| 0.7361111111111112 | 150.964 |
| 0.7368055555555556 | 150.964 |
| 0.7374999999999999 | 150.964 |
| 0.7381944444444444 | 150.964 |
| 0.7388888888888889 | 150.964 |
| 0.7395833333333334 | 146.423 |
| 0.7402777777777777 | 146.423 |
| 0.7409722222222223 | 146.423 |
| 0.7416666666666667 | 146.423 |
| 0.7423611111111111 | 141.884 |
| 0.7430555555555555 | 141.884 |
| 0.74375 | 141.884 |
| 0.7444444444444445 | 141.884 |
| 0.7451388888888889 | 137.347 |
| 0.7458333333333332 | 137.347 |
| 0.7465277777777778 | 137.347 |
| 0.7472222222222222 | 137.347 |
| 0.7479166666666667 | 137.347 |
| 0.748611111111111 | 137.347 |
| 0.7493055555555556 | 132.814 |
| 0.75 | 132.814 |
| 0.7506944444444444 | 132.814 |
| 0.751388888888889 | 132.814 |
| 0.7520833333333333 | 128.284 |
| 0.7527777777777778 | 128.284 |
| 0.7534722222222222 | 128.284 |
| 0.7541666666666668 | 128.284 |
| 0.7548611111111111 | 128.284 |
| 0.7555555555555555 | 128.284 |
| 0.75625 | 123.758 |
| 0.7569444444444445 | 123.758 |
| 0.7576388888888889 | 123.758 |
| 0.7583333333333333 | 123.758 |
| 0.7590277777777777 | 123.758 |
| 0.7597222222222223 | 119.235 |
| 0.7604166666666666 | 119.235 |
| 0.7611111111111111 | 119.235 |
| 0.7618055555555556 | 119.235 |
| 0.7625000000000001 | 119.235 |
| 0.7631944444444444 | 114.716 |
| 0.7638888888888888 | 114.716 |
| 0.7645833333333334 | 114.716 |
| 0.7652777777777778 | 114.716 |
| 0.7659722222222222 | 110.201 |
| 0.7666666666666666 | 110.201 |
| 0.7673611111111112 | 110.201 |
| 0.7680555555555556 | 110.201 |
| 0.7687499999999999 | 110.201 |
| 0.7694444444444444 | 110.201 |
| 0.7701388888888889 | 105.69 |
| 0.7708333333333334 | 105.69 |
| 0.7715277777777777 | 105.69 |
| 0.7722222222222223 | 105.69 |
| 0.7729166666666667 | 105.69 |
| 0.7736111111111111 | 101.184 |
| 0.7743055555555555 | 101.184 |
| 0.775 | 101.184 |
| 0.7756944444444445 | 101.184 |
| 0.7763888888888889 | 101.184 |
| 0.7770833333333332 | 101.184 |
| 0.7777777777777778 | 96.682 |
| 0.7784722222222222 | 96.682 |
| 0.7791666666666667 | 96.682 |
| 0.779861111111111 | 96.682 |
| 0.7805555555555556 | 96.682 |
| 0.78125 | 92.184 |
| 0.7819444444444444 | 92.184 |
| 0.782638888888889 | 92.184 |
| 0.7833333333333333 | 92.184 |
| 0.7840277777777778 | 92.184 |
| 0.7847222222222222 | 92.184 |
| 0.7854166666666668 | 87.692 |
| 0.7861111111111111 | 87.692 |
| 0.7868055555555555 | 87.692 |
| 0.7875 | 87.692 |
| 0.7881944444444445 | 87.692 |
| 0.7888888888888889 | 83.205 |
| 0.7895833333333333 | 83.205 |
| 0.7902777777777777 | 83.205 |
| 0.7909722222222223 | 83.205 |
| 0.7916666666666666 | 83.205 |
| 0.7923611111111111 | 78.722 |
| 0.7930555555555556 | 78.722 |
| 0.7937500000000001 | 78.722 |
| 0.7944444444444444 | 78.722 |
| 0.7951388888888888 | 78.722 |
| 0.7958333333333334 | 74.246 |
| 0.7965277777777778 | 74.246 |
| 0.7972222222222222 | 74.246 |
| 0.7979166666666666 | 74.246 |
| 0.7986111111111112 | 74.246 |
| 0.7993055555555556 | 69.775 |
| 0.7999999999999999 | 69.775 |
| 0.8006944444444444 | 69.775 |
| 0.8013888888888889 | 69.775 |
| 0.8020833333333334 | 65.31 |
| 0.8027777777777777 | 65.31 |
| 0.8034722222222223 | 65.31 |
| 0.8041666666666667 | 65.31 |
| 0.8048611111111111 | 65.31 |
| 0.8055555555555555 | 60.85 |
| 0.80625 | 60.85 |
| 0.8069444444444445 | 60.85 |
| 0.8076388888888889 | 60.85 |
| 0.8083333333333332 | 60.85 |
| 0.8090277777777778 | 56.398 |
| 0.8097222222222222 | 56.398 |
| 0.8104166666666667 | 56.398 |
| 0.811111111111111 | 56.398 |
| 0.8118055555555556 | 56.398 |
| 0.8125 | 51.951 |
| 0.8131944444444444 | 51.951 |
| 0.813888888888889 | 51.951 |
| 0.8145833333333333 | 51.951 |
| 0.8152777777777778 | 51.951 |
| 0.8159722222222222 | 47.511 |
| 0.8166666666666668 | 47.511 |
| 0.8173611111111111 | 47.511 |
| 0.8180555555555555 | 47.511 |
| 0.81875 | 47.511 |
| 0.8194444444444445 | 47.511 |
| 0.8201388888888889 | 43.079 |
| 0.8208333333333333 | 43.079 |
| 0.8215277777777777 | 43.079 |
| 0.8222222222222223 | 38.653 |
| 0.8229166666666666 | 38.653 |
| 0.8236111111111111 | 38.653 |
| 0.8243055555555556 | 38.653 |
| 0.8250000000000001 | 38.653 |
| 0.8256944444444444 | 34.234 |
| 0.8263888888888888 | 34.234 |
| 0.8270833333333334 | 34.234 |
| 0.8277777777777778 | 34.234 |
| 0.8284722222222222 | 34.234 |
| 0.8291666666666666 | 29.823 |
| 0.8298611111111112 | 29.823 |
| 0.8305555555555556 | 29.823 |
| 0.8312499999999999 | 29.823 |
| 0.8319444444444444 | 25.419 |
| 0.8326388888888889 | 25.419 |
| 0.8333333333333334 | 25.419 |
| 0.8340277777777777 | 25.419 |
| 0.8347222222222223 | 21.024 |
| 0.8354166666666667 | 21.024 |
| 0.8361111111111111 | 21.024 |
| 0.8368055555555555 | 21.024 |
| 0.8375 | 21.024 |
| 0.8381944444444445 | 16.636 |
| 0.8388888888888889 | 16.636 |
| 0.8395833333333332 | 16.636 |
| 0.8402777777777778 | 16.636 |
| 0.8409722222222222 | 16.636 |
| 0.8416666666666667 | 12.257 |
| 0.842361111111111 | 12.257 |
| 0.8430555555555556 | 12.257 |
| 0.84375 | 12.257 |
| 0.8444444444444444 | 12.257 |
| 0.845138888888889 | 12.257 |
| 0.8458333333333333 | 12.257 |
| 0.8465277777777778 | 7.887 |
| 0.8472222222222222 | 7.887 |
| 0.8479166666666668 | 7.887 |
| 0.8486111111111111 | 7.887 |
| 0.8493055555555555 | 7.887 |
| 0.85 | 3.525 |
| 0.8506944444444445 | 3.525 |
| 0.8513888888888889 | 3.525 |
| 0.8520833333333333 | 3.525 |
| 0.8527777777777777 | 3.525 |
| 0.8534722222222223 | 3.525 |
| 0.8541666666666666 | 3.525 |
| 0.8548611111111111 | 3.525 |
| 0.8555555555555556 | 3.525 |
| 0.8562500000000001 | 3.525 |
| 0.8569444444444444 | 0 |
| 0.8576388888888888 | 0 |
| 0.8583333333333334 | 0 |
| 0.8590277777777778 | 0 |
| 0.8597222222222222 | 0 |
| 0.8604166666666666 | 0 |
| 0.8611111111111112 | 0 |
| 0.8618055555555556 | 0 |
| 0.8624999999999999 | 0 |
| 0.8631944444444444 | 0 |
| 0.8638888888888889 | 0 |
| 0.8645833333333334 | 0 |
| 0.8652777777777777 | 0 |
| 0.8659722222222223 | 0 |
| 0.8666666666666667 | 0 |
| 0.8673611111111111 | 0 |
| 0.8680555555555555 | 0 |
| 0.86875 | 0 |
| 0.8694444444444445 | 0 |
| 0.8701388888888889 | 0 |
| 0.8708333333333332 | 0 |
| 0.8715277777777778 | 0 |
| 0.8722222222222222 | 0 |
| 0.8729166666666667 | 0 |
| 0.873611111111111 | 0 |
| 0.8743055555555556 | 0 |
| 0.875 | 0 |
| 0.8756944444444444 | 0 |
| 0.876388888888889 | 0 |
| 0.8770833333333333 | 0 |
| 0.8777777777777778 | 0 |
| 0.8784722222222222 | 0 |
| 0.8791666666666668 | 0 |
| 0.8798611111111111 | 0 |
| 0.8805555555555555 | 0 |
| 0.88125 | 0 |
| 0.8819444444444445 | 0 |
| 0.8826388888888889 | 0 |
| 0.8833333333333333 | 0 |
| 0.8840277777777777 | 0 |
| 0.8847222222222223 | 0 |
| 0.8854166666666666 | 0 |
| 0.8861111111111111 | 0 |
| 0.8868055555555556 | 0 |
| 0.8875000000000001 | 0 |
| 0.8881944444444444 | 0 |
| 0.8888888888888888 | 0 |
| 0.8895833333333334 | 0 |
| 0.8902777777777778 | 0 |
| 0.8909722222222222 | 0 |
| 0.8916666666666666 | 0 |
| 0.8923611111111112 | 0 |
| 0.8930555555555556 | 0 |
| 0.8937499999999999 | 0 |
| 0.8944444444444444 | 0 |
| 0.8951388888888889 | 0 |
| 0.8958333333333334 | 0 |
| 0.8965277777777777 | 0 |
| 0.8972222222222223 | 0 |
| 0.8979166666666667 | 0 |
| 0.8986111111111111 | 0 |
| 0.8993055555555555 | 0 |
| 0.9 | 0 |
| 0.9006944444444445 | 0 |
| 0.9013888888888889 | 0 |
| 0.9020833333333332 | 0 |
| 0.9027777777777778 | 0 |
| 0.9034722222222222 | 0 |
| 0.9041666666666667 | 0 |
| 0.904861111111111 | 0 |
| 0.9055555555555556 | 0 |
| 0.90625 | 0 |
| 0.9069444444444444 | 0 |
| 0.907638888888889 | 0 |
| 0.9083333333333333 | 0 |
| 0.9090277777777778 | 0 |
| 0.9097222222222222 | 0 |
| 0.9104166666666668 | 0 |
| 0.9111111111111111 | 0 |
| 0.9118055555555555 | 0 |
| 0.9125 | 0 |
| 0.9131944444444445 | 0 |
| 0.9138888888888889 | 0 |
| 0.9145833333333333 | 0 |
| 0.9152777777777777 | 0 |
| 0.9159722222222223 | 0 |
| 0.9166666666666666 | 0 |
| 0.9173611111111111 | 0 |
| 0.9180555555555556 | 0 |
| 0.9187500000000001 | 0 |
| 0.9194444444444444 | 0 |
| 0.9201388888888888 | 0 |
| 0.9208333333333334 | 0 |
| 0.9215277777777778 | 0 |
| 0.9222222222222222 | 0 |
| 0.9229166666666666 | 0 |
| 0.9236111111111112 | 0 |
| 0.9243055555555556 | 0 |
| 0.9249999999999999 | 0 |
| 0.9256944444444444 | 0 |
| 0.9263888888888889 | 0 |
| 0.9270833333333334 | 0 |
| 0.9277777777777777 | 0 |
| 0.9284722222222223 | 0 |
| 0.9291666666666667 | 0 |
| 0.9298611111111111 | 0 |
| 0.9305555555555555 | 0 |
| 0.93125 | 0 |
| 0.9319444444444445 | 0 |
| 0.9326388888888889 | 0 |
| 0.9333333333333332 | 0 |
| 0.9340277777777778 | 0 |
| 0.9347222222222222 | 0 |
| 0.9354166666666667 | 0 |
| 0.936111111111111 | 0 |
| 0.9368055555555556 | 0 |
| 0.9375 | 0 |
| 0.9381944444444444 | 0 |
| 0.938888888888889 | 0 |
| 0.9395833333333333 | 0 |
| 0.9402777777777778 | 0 |
| 0.9409722222222222 | 0 |
| 0.9416666666666668 | 0 |
| 0.9423611111111111 | 0 |
| 0.9430555555555555 | 0 |
| 0.94375 | 0 |
| 0.9444444444444445 | 0 |
| 0.9451388888888889 | 0 |
| 0.9458333333333333 | 0 |
| 0.9465277777777777 | 0 |
| 0.9472222222222223 | 0 |
| 0.9479166666666666 | 0 |
| 0.9486111111111111 | 0 |
| 0.9493055555555556 | 0 |
| 0.9500000000000001 | 0 |
| 0.9506944444444444 | 0 |
| 0.9513888888888888 | 0 |
| 0.9520833333333334 | 0 |
| 0.9527777777777778 | 0 |
| 0.9534722222222222 | 0 |
| 0.9541666666666666 | 0 |
| 0.9548611111111112 | 0 |
| 0.9555555555555556 | 0 |
| 0.9562499999999999 | 0 |
| 0.9569444444444444 | 0 |
| 0.9576388888888889 | 0 |
| 0.9583333333333334 | 0 |
| 0.9590277777777777 | 0 |
| 0.9597222222222223 | 0 |
| 0.9604166666666667 | 0 |
| 0.9611111111111111 | 0 |
| 0.9618055555555555 | 0 |
| 0.9625 | 0 |
| 0.9631944444444445 | 0 |
| 0.9638888888888889 | 0 |
| 0.9645833333333332 | 0 |
| 0.9652777777777778 | 0 |
| 0.9659722222222222 | 0 |
| 0.9666666666666667 | 0 |
| 0.967361111111111 | 0 |
| 0.9680555555555556 | 0 |
| 0.96875 | 0 |
| 0.9694444444444444 | 0 |
| 0.970138888888889 | 0 |
| 0.9708333333333333 | 0 |
| 0.9715277777777778 | 0 |
| 0.9722222222222222 | 0 |
| 0.9729166666666668 | 0 |
| 0.9736111111111111 | 0 |
| 0.9743055555555555 | 0 |
| 0.975 | 0 |
| 0.9756944444444445 | 0 |
| 0.9763888888888889 | 0 |
| 0.9770833333333333 | 0 |
| 0.9777777777777777 | 0 |
| 0.9784722222222223 | 0 |
| 0.9791666666666666 | 0 |
| 0.9798611111111111 | 0 |
| 0.9805555555555556 | 0 |
| 0.9812500000000001 | 0 |
| 0.9819444444444444 | 0 |
| 0.9826388888888888 | 0 |
| 0.9833333333333334 | 0 |
| 0.9840277777777778 | 0 |
| 0.9847222222222222 | 0 |
| 0.9854166666666666 | 0 |
| 0.9861111111111112 | 0 |
| 0.9868055555555556 | 0 |
| 0.9874999999999999 | 0 |
| 0.9881944444444444 | 0 |
| 0.9888888888888889 | 0 |
| 0.9895833333333334 | 0 |
| 0.9902777777777777 | 0 |
| 0.9909722222222223 | 0 |
| 0.9916666666666667 | 0 |
| 0.9923611111111111 | 0 |
| 0.9930555555555555 | 0 |
| 0.99375 | 0 |
| 0.9944444444444445 | 0 |
| 0.9951388888888889 | 0 |
| 0.9958333333333332 | 0 |
| 0.9965277777777778 | 0 |
| 0.9972222222222222 | 0 |
| 0.9979166666666667 | 0 |
| 0.998611111111111 | 0 |
| 0.9993055555555556 | 0 |